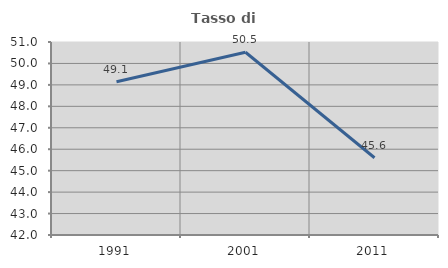
| Category | Tasso di occupazione   |
|---|---|
| 1991.0 | 49.148 |
| 2001.0 | 50.523 |
| 2011.0 | 45.604 |